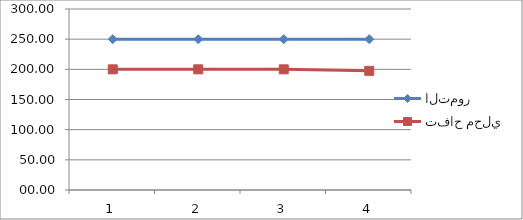
| Category | التمور | تفاح محلي |
|---|---|---|
| 0 | 250 | 200 |
| 1 | 250 | 200 |
| 2 | 250 | 200 |
| 3 | 250 | 197.5 |